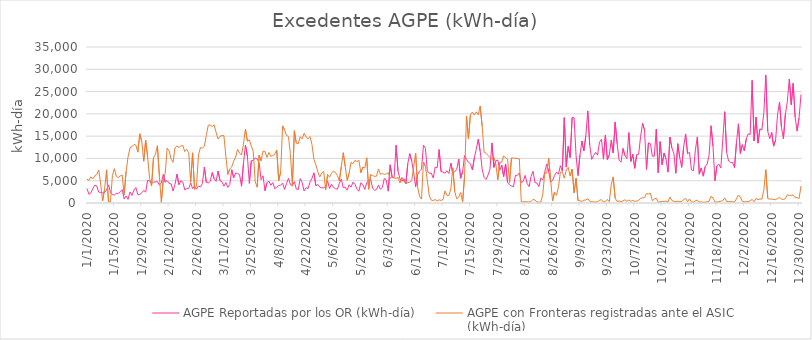
| Category | AGPE Reportadas por los OR (kWh-día) | AGPE con Fronteras registradas ante el ASIC 
(kWh-día) |
|---|---|---|
| 1/1/20 | 3263.511 | 5316.92 |
| 1/2/20 | 1966.536 | 5108.18 |
| 1/3/20 | 2268.724 | 5872.99 |
| 1/4/20 | 3253.407 | 5403.34 |
| 1/5/20 | 4000.375 | 6104.32 |
| 1/6/20 | 3830.209 | 6368.6 |
| 1/7/20 | 2446.166 | 7418.22 |
| 1/8/20 | 2352.176 | 4259.12 |
| 1/9/20 | 2251.608 | 484.27 |
| 1/10/20 | 2404.767 | 3078.58 |
| 1/11/20 | 2888.851 | 7442.29 |
| 1/12/20 | 4079.042 | 262.56 |
| 1/13/20 | 2451.837 | 290.89 |
| 1/14/20 | 1901.826 | 6141.19 |
| 1/15/20 | 1769.116 | 7700.11 |
| 1/16/20 | 2185.335 | 5989.29 |
| 1/17/20 | 2097.547 | 5699.48 |
| 1/18/20 | 2565.993 | 6057.02 |
| 1/19/20 | 2986.898 | 6295.48 |
| 1/20/20 | 878.441 | 1781.65 |
| 1/21/20 | 1563.137 | 7098.29 |
| 1/22/20 | 826.619 | 10317.63 |
| 1/23/20 | 2480.544 | 12384.03 |
| 1/24/20 | 1680.344 | 12638.01 |
| 1/25/20 | 2910.104 | 13110 |
| 1/26/20 | 3465.667 | 12981.51 |
| 1/27/20 | 1867.14 | 11417.7 |
| 1/28/20 | 1932.94 | 15516.82 |
| 1/29/20 | 2294.16 | 13809.27 |
| 1/30/20 | 2820.851 | 9373.43 |
| 1/31/20 | 2441.725 | 14084.2 |
| 2/1/20 | 5106.141 | 10386.54 |
| 2/2/20 | 4940.1 | 5526.32 |
| 2/3/20 | 4395.97 | 3804.09 |
| 2/4/20 | 4683.074 | 10123.15 |
| 2/5/20 | 4745.142 | 10947.05 |
| 2/6/20 | 4786.231 | 12858.41 |
| 2/7/20 | 4041.873 | 6109.27 |
| 2/8/20 | 4451.48 | 166.76 |
| 2/9/20 | 6399.215 | 5102.01 |
| 2/10/20 | 4673.814 | 6698.54 |
| 2/11/20 | 5021.802 | 12324.13 |
| 2/12/20 | 4396.984 | 11703.4 |
| 2/13/20 | 4282.639 | 9848.15 |
| 2/14/20 | 2687.751 | 9117.12 |
| 2/15/20 | 4180.604 | 12410.91 |
| 2/16/20 | 6469.289 | 12762.34 |
| 2/17/20 | 4110.805 | 12461.79 |
| 2/18/20 | 4987.781 | 12785.47 |
| 2/19/20 | 4680.69 | 12873.94 |
| 2/20/20 | 2932.951 | 11527.79 |
| 2/21/20 | 3249.191 | 12006.43 |
| 2/22/20 | 3264.673 | 11283.31 |
| 2/23/20 | 4505.046 | 4669.48 |
| 2/24/20 | 3231.717 | 11247.27 |
| 2/25/20 | 3863.472 | 3069.15 |
| 2/26/20 | 3083.337 | 3865.17 |
| 2/27/20 | 3823.435 | 10835.76 |
| 2/28/20 | 3621.571 | 12447.36 |
| 2/29/20 | 4357.237 | 12307.35 |
| 3/1/20 | 8045.312 | 12715.87 |
| 3/2/20 | 4648.95 | 15162.97 |
| 3/3/20 | 4492.956 | 17450.17 |
| 3/4/20 | 4821.259 | 17492.87 |
| 3/5/20 | 6832.564 | 17168.25 |
| 3/6/20 | 5430.884 | 17524.2 |
| 3/7/20 | 4853.37 | 15856.37 |
| 3/8/20 | 7184.394 | 14357.93 |
| 3/9/20 | 5017.448 | 14948.9 |
| 3/10/20 | 4753.488 | 15131.18 |
| 3/11/20 | 3770.319 | 15109.05 |
| 3/12/20 | 4583.658 | 10460.06 |
| 3/13/20 | 3514.319 | 6408.11 |
| 3/14/20 | 4133.535 | 7669.76 |
| 3/15/20 | 7470.515 | 8094.33 |
| 3/16/20 | 5664.264 | 9401.74 |
| 3/17/20 | 6734.34 | 10318.02 |
| 3/18/20 | 6591.247 | 12024.81 |
| 3/19/20 | 6349.727 | 11211.23 |
| 3/20/20 | 3762.263 | 10767.48 |
| 3/21/20 | 8884.119 | 13207.58 |
| 3/22/20 | 13011.862 | 16602.64 |
| 3/23/20 | 10546.267 | 13880.42 |
| 3/24/20 | 4415.379 | 14180.85 |
| 3/25/20 | 9474.308 | 12792.83 |
| 3/26/20 | 9575.753 | 11582.95 |
| 3/27/20 | 10112.825 | 4790.13 |
| 3/28/20 | 9857.981 | 3562.84 |
| 3/29/20 | 9028.297 | 10753.5 |
| 3/30/20 | 5227.224 | 9456.07 |
| 3/31/20 | 6106.24 | 11639.33 |
| 4/1/20 | 2729.133 | 11532.6 |
| 4/2/20 | 4589.531 | 10227.81 |
| 4/3/20 | 4882.545 | 11332.7 |
| 4/4/20 | 3985.005 | 10463.85 |
| 4/5/20 | 4598.416 | 10627.19 |
| 4/6/20 | 3187.988 | 10942.84 |
| 4/7/20 | 3550.985 | 11895.66 |
| 4/8/20 | 3911.76 | 5023.2 |
| 4/9/20 | 3993.504 | 6900.18 |
| 4/10/20 | 4480.898 | 17301.86 |
| 4/11/20 | 3038.235 | 16358.68 |
| 4/12/20 | 4365.761 | 15148.85 |
| 4/13/20 | 5542.723 | 14929.6 |
| 4/14/20 | 4125.5 | 10912.3 |
| 4/15/20 | 3922.526 | 3779.1 |
| 4/16/20 | 4795.709 | 16224.52 |
| 4/17/20 | 3124.261 | 13454.45 |
| 4/18/20 | 3033.739 | 13270.72 |
| 4/19/20 | 5469.71 | 14877.15 |
| 4/20/20 | 4557.884 | 14375.28 |
| 4/21/20 | 2685.295 | 15672.23 |
| 4/22/20 | 3429.469 | 14801.63 |
| 4/23/20 | 3223.033 | 14399.41 |
| 4/24/20 | 4688.555 | 14902.58 |
| 4/25/20 | 5533.847 | 13162.62 |
| 4/26/20 | 6758.297 | 9812.97 |
| 4/27/20 | 3881.708 | 8601.2 |
| 4/28/20 | 4154.345 | 6996.16 |
| 4/29/20 | 3575.512 | 5846.04 |
| 4/30/20 | 3385.41 | 6744.55 |
| 5/1/20 | 3425.503 | 7076.87 |
| 5/2/20 | 3593.154 | 2949.05 |
| 5/3/20 | 4929.76 | 6379.71 |
| 5/4/20 | 3267.957 | 5787.82 |
| 5/5/20 | 4224.156 | 6677.55 |
| 5/6/20 | 3503.991 | 7167.59 |
| 5/7/20 | 3213.967 | 6831.26 |
| 5/8/20 | 3083.894 | 6156.2 |
| 5/9/20 | 4414.507 | 4961.56 |
| 5/10/20 | 5372.959 | 8197.51 |
| 5/11/20 | 3451.541 | 11284.48 |
| 5/12/20 | 3554.732 | 8193.25 |
| 5/13/20 | 2890.581 | 5111.14 |
| 5/14/20 | 4101.408 | 6701.36 |
| 5/15/20 | 3577.704 | 9122.15 |
| 5/16/20 | 4692.637 | 8825.49 |
| 5/17/20 | 4210 | 9578.61 |
| 5/18/20 | 3078.347 | 9284.57 |
| 5/19/20 | 2653.777 | 9602.77 |
| 5/20/20 | 4542.937 | 6792.71 |
| 5/21/20 | 4157.438 | 8036.45 |
| 5/22/20 | 3038.36 | 7847.34 |
| 5/23/20 | 4511.655 | 10135.9 |
| 5/24/20 | 5139.374 | 3086.3 |
| 5/25/20 | 5389.621 | 6368.08 |
| 5/26/20 | 3350.354 | 6170.05 |
| 5/27/20 | 2810.836 | 5970.34 |
| 5/28/20 | 3035.502 | 6019.43 |
| 5/29/20 | 4011.146 | 7638.65 |
| 5/30/20 | 3108.434 | 6438.92 |
| 5/31/20 | 3486.335 | 6620.64 |
| 6/1/20 | 5560.062 | 6420.71 |
| 6/2/20 | 5103.337 | 6535.12 |
| 6/3/20 | 2653.838 | 6825.72 |
| 6/4/20 | 8566.706 | 5464.33 |
| 6/5/20 | 5726.654 | 5972.67 |
| 6/6/20 | 5709.603 | 5582.95 |
| 6/7/20 | 12968.391 | 5532.25 |
| 6/8/20 | 7133.008 | 5753.57 |
| 6/9/20 | 5422.133 | 4471.92 |
| 6/10/20 | 4872.655 | 5745.73 |
| 6/11/20 | 5478.603 | 4906.57 |
| 6/12/20 | 4358.893 | 4285.68 |
| 6/13/20 | 8852.027 | 4577.22 |
| 6/14/20 | 11068.759 | 4642.62 |
| 6/15/20 | 9403.483 | 5113.79 |
| 6/16/20 | 6807.441 | 8139.26 |
| 6/17/20 | 3655.059 | 11206.59 |
| 6/18/20 | 6330.762 | 3653.59 |
| 6/19/20 | 7167.342 | 1530.18 |
| 6/20/20 | 7590.276 | 890.42 |
| 6/21/20 | 12975.573 | 9175.48 |
| 6/22/20 | 12290.236 | 8207.78 |
| 6/23/20 | 7166.413 | 4941.17 |
| 6/24/20 | 6664.224 | 1540.42 |
| 6/25/20 | 6695.943 | 635.84 |
| 6/26/20 | 5609.826 | 551.63 |
| 6/27/20 | 8056.339 | 807.17 |
| 6/28/20 | 7891.674 | 449.1 |
| 6/29/20 | 11995.697 | 715.73 |
| 6/30/20 | 7051.651 | 577.89 |
| 7/1/20 | 6939.792 | 769.82 |
| 7/2/20 | 6663.247 | 2703.67 |
| 7/3/20 | 7225.032 | 1709.84 |
| 7/4/20 | 6603.436 | 1696.46 |
| 7/5/20 | 8935.305 | 3160.05 |
| 7/6/20 | 6593.651 | 7885.33 |
| 7/7/20 | 7090.53 | 2568.93 |
| 7/8/20 | 7489.865 | 932.01 |
| 7/9/20 | 9858.594 | 1295.64 |
| 7/10/20 | 5541.848 | 2349.62 |
| 7/11/20 | 6976.812 | 257.97 |
| 7/12/20 | 10642.073 | 5847.08 |
| 7/13/20 | 9790.121 | 19528.27 |
| 7/14/20 | 9120.735 | 14452.98 |
| 7/15/20 | 8805.365 | 19756.49 |
| 7/16/20 | 7400.038 | 20393.65 |
| 7/17/20 | 10074.202 | 19719.25 |
| 7/18/20 | 12069.751 | 20430.8 |
| 7/19/20 | 14322.884 | 19806.71 |
| 7/20/20 | 11606.249 | 21749.91 |
| 7/21/20 | 7595.788 | 17268.16 |
| 7/22/20 | 5752.372 | 11412.69 |
| 7/23/20 | 5273.176 | 11145.51 |
| 7/24/20 | 6278.246 | 10684.26 |
| 7/25/20 | 7593.403 | 10161.37 |
| 7/26/20 | 13469.35 | 9846.73 |
| 7/27/20 | 7993.535 | 10284.14 |
| 7/28/20 | 9475.161 | 8702.91 |
| 7/29/20 | 9631.015 | 5244.61 |
| 7/30/20 | 7321.382 | 9104.16 |
| 7/31/20 | 8518.13 | 9147.97 |
| 8/1/20 | 5940.111 | 10575.37 |
| 8/2/20 | 8759.488 | 10119.21 |
| 8/3/20 | 4589.268 | 9873.06 |
| 8/4/20 | 4062.31 | 4590.88 |
| 8/5/20 | 3821.626 | 10115.87 |
| 8/6/20 | 3638.344 | 10064.37 |
| 8/7/20 | 6183.844 | 10070.36 |
| 8/8/20 | 6196.158 | 9963.65 |
| 8/9/20 | 6749.632 | 9921.52 |
| 8/10/20 | 4577.488 | 241.25 |
| 8/11/20 | 4867.569 | 260.52 |
| 8/12/20 | 6187.624 | 294.71 |
| 8/13/20 | 4369.044 | 270.32 |
| 8/14/20 | 3680.195 | 211.83 |
| 8/15/20 | 5961.335 | 328.43 |
| 8/16/20 | 7128.346 | 808.5 |
| 8/17/20 | 4595.145 | 660.98 |
| 8/18/20 | 4480.472 | 249.68 |
| 8/19/20 | 3659.918 | 164.74 |
| 8/20/20 | 5610.707 | 245.77 |
| 8/21/20 | 5185.686 | 1907.2 |
| 8/22/20 | 6946.311 | 6696.42 |
| 8/23/20 | 8714.76 | 6681.93 |
| 8/24/20 | 7109.514 | 10043.63 |
| 8/25/20 | 4699.597 | 5183.15 |
| 8/26/20 | 5041.875 | 456.26 |
| 8/27/20 | 6129.26 | 2421.78 |
| 8/28/20 | 6925.878 | 1733.16 |
| 8/29/20 | 6467.323 | 3636.94 |
| 8/30/20 | 8380.556 | 6900.22 |
| 8/31/20 | 7153.179 | 6981.28 |
| 9/1/20 | 19148.31 | 5566.8 |
| 9/2/20 | 8054.776 | 7409.23 |
| 9/3/20 | 12760.005 | 8008.03 |
| 9/4/20 | 10215.334 | 6037.97 |
| 9/5/20 | 19140.469 | 7613.94 |
| 9/6/20 | 19165.45 | 2292.84 |
| 9/7/20 | 10698.702 | 5562.05 |
| 9/8/20 | 6157.813 | 564.3 |
| 9/9/20 | 10810.023 | 494.44 |
| 9/10/20 | 13916.67 | 346.8 |
| 9/11/20 | 11681.42 | 629.17 |
| 9/12/20 | 15117.701 | 672.95 |
| 9/13/20 | 20656.452 | 987.76 |
| 9/14/20 | 12934.759 | 379.42 |
| 9/15/20 | 9778.818 | 253.09 |
| 9/16/20 | 10694.041 | 287.35 |
| 9/17/20 | 11382.389 | 192.54 |
| 9/18/20 | 10739.953 | 313.35 |
| 9/19/20 | 13657.499 | 604.74 |
| 9/20/20 | 14301.448 | 745.75 |
| 9/21/20 | 9826.749 | 216.9 |
| 9/22/20 | 15243.817 | 368.33 |
| 9/23/20 | 9741.166 | 797.72 |
| 9/24/20 | 10812.161 | 290.87 |
| 9/25/20 | 14111.891 | 4134.57 |
| 9/26/20 | 11236.71 | 5852.43 |
| 9/27/20 | 18120.723 | 1040.68 |
| 9/28/20 | 13304.023 | 345.92 |
| 9/29/20 | 9608.775 | 463.9 |
| 9/30/20 | 9165.446 | 300.03 |
| 10/1/20 | 12249.027 | 475.45 |
| 10/2/20 | 10642.407 | 723.37 |
| 10/3/20 | 9951.019 | 382.63 |
| 10/4/20 | 15803.019 | 668.26 |
| 10/5/20 | 9327.205 | 369.99 |
| 10/6/20 | 10903.525 | 575.04 |
| 10/7/20 | 7791.14 | 386.59 |
| 10/8/20 | 10866.69 | 431.33 |
| 10/9/20 | 10928.822 | 630.01 |
| 10/10/20 | 14924.052 | 1030.08 |
| 10/11/20 | 17850.147 | 1161.75 |
| 10/12/20 | 16396.296 | 1229.48 |
| 10/13/20 | 7522.296 | 2108.14 |
| 10/14/20 | 13497.619 | 2000.89 |
| 10/15/20 | 13335.209 | 2200.11 |
| 10/16/20 | 10514.804 | 488.93 |
| 10/17/20 | 10461.176 | 898.9 |
| 10/18/20 | 16568.96 | 1083.49 |
| 10/19/20 | 6805.933 | 154.94 |
| 10/20/20 | 13764.362 | 307.34 |
| 10/21/20 | 8578.745 | 360.57 |
| 10/22/20 | 11228.03 | 346.31 |
| 10/23/20 | 9803.718 | 428.32 |
| 10/24/20 | 6925.85 | 230.14 |
| 10/25/20 | 14797.992 | 1344.75 |
| 10/26/20 | 12315.487 | 539.96 |
| 10/27/20 | 11130.904 | 394.49 |
| 10/28/20 | 6674.873 | 294.59 |
| 10/29/20 | 13306.13 | 408.84 |
| 10/30/20 | 10172.869 | 291.21 |
| 10/31/20 | 7996.356 | 348.53 |
| 11/1/20 | 12523.281 | 761.14 |
| 11/2/20 | 15492.293 | 1034.12 |
| 11/3/20 | 11082.93 | 287.04 |
| 11/4/20 | 11384.869 | 911.44 |
| 11/5/20 | 7397.948 | 238.6 |
| 11/6/20 | 7229.67 | 196.94 |
| 11/7/20 | 11900.722 | 506.52 |
| 11/8/20 | 14828.923 | 653.54 |
| 11/9/20 | 6465.97 | 162.3 |
| 11/10/20 | 7874.385 | 278.57 |
| 11/11/20 | 6009.968 | 155 |
| 11/12/20 | 8140.47 | 205.75 |
| 11/13/20 | 8748.766 | 246.61 |
| 11/14/20 | 10662.623 | 402.03 |
| 11/15/20 | 17339.333 | 1495.69 |
| 11/16/20 | 12772.345 | 1142.2 |
| 11/17/20 | 4989.456 | 226.46 |
| 11/18/20 | 8343.684 | 218.84 |
| 11/19/20 | 8688.3 | 294.23 |
| 11/20/20 | 7869.369 | 413.35 |
| 11/21/20 | 14170.211 | 534.25 |
| 11/22/20 | 20485.894 | 1151.51 |
| 11/23/20 | 11305.103 | 338.96 |
| 11/24/20 | 9418.239 | 325.94 |
| 11/25/20 | 9057.316 | 335.49 |
| 11/26/20 | 9125.7 | 283.29 |
| 11/27/20 | 7961.083 | 238.32 |
| 11/28/20 | 13519.176 | 924.79 |
| 11/29/20 | 17773.772 | 1808.19 |
| 11/30/20 | 11111.888 | 1298.65 |
| 12/1/20 | 13084.784 | 333.59 |
| 12/2/20 | 11694.391 | 278.34 |
| 12/3/20 | 14313.704 | 292.19 |
| 12/4/20 | 15520.736 | 298.32 |
| 12/5/20 | 15358.855 | 494.02 |
| 12/6/20 | 27510.101 | 812.88 |
| 12/7/20 | 13921.899 | 264.99 |
| 12/8/20 | 19245.504 | 1014.54 |
| 12/9/20 | 13438.97 | 734.08 |
| 12/10/20 | 16635.181 | 929.31 |
| 12/11/20 | 16378.834 | 845.53 |
| 12/12/20 | 20306.68 | 2980.05 |
| 12/13/20 | 28668.233 | 7469.24 |
| 12/14/20 | 16100.429 | 1018.4 |
| 12/15/20 | 14402.603 | 860.38 |
| 12/16/20 | 15835.227 | 882.21 |
| 12/17/20 | 12761.781 | 779.07 |
| 12/18/20 | 14110.979 | 757.19 |
| 12/19/20 | 19780.795 | 1015.62 |
| 12/20/20 | 22641.675 | 1263.58 |
| 12/21/20 | 16951.915 | 890.2 |
| 12/22/20 | 14404.007 | 791.33 |
| 12/23/20 | 19886.426 | 983.27 |
| 12/24/20 | 22730.188 | 1846.31 |
| 12/25/20 | 27823.699 | 1698.8 |
| 12/26/20 | 22061.794 | 1749.14 |
| 12/27/20 | 26859.068 | 1802.96 |
| 12/28/20 | 19208.352 | 1193.41 |
| 12/29/20 | 16134.625 | 1221.62 |
| 12/30/20 | 19110.836 | 992.72 |
| 12/31/20 | 24346.39 | 3814.34 |